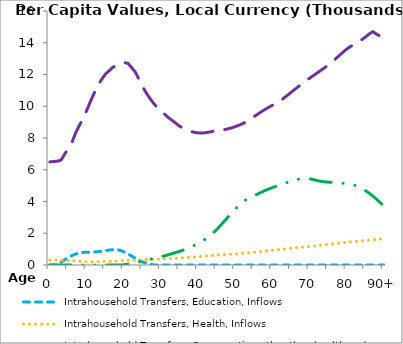
| Category | Intrahousehold Transfers, Education, Inflows | Intrahousehold Transfers, Health, Inflows | Intrahousehold Transfers, Consumption other than health and education, Inflows | Intrahousehold Transfers, Saving, Inflows |
|---|---|---|---|---|
| 0 | 0 | 315.968 | 6493.142 | 0 |
|  | 0 | 311.324 | 6522.141 | 0 |
| 2 | 13.528 | 306.679 | 6537.956 | 0 |
| 3 | 173.255 | 300.897 | 6603.939 | 0 |
| 4 | 332.982 | 291.162 | 6987.979 | 0 |
| 5 | 481.796 | 281.075 | 7336.597 | 0 |
| 6 | 604.684 | 267.98 | 7761.841 | 0 |
| 7 | 695.099 | 250.585 | 8347.404 | 0 |
| 8 | 752.086 | 232.706 | 8820.788 | 0 |
| 9 | 792.489 | 220.252 | 9223.739 | 0 |
| 10 | 805.499 | 210.448 | 9780.597 | 0 |
| 11 | 815.918 | 202.708 | 10343.697 | 0 |
| 12 | 822.001 | 203.2 | 10853.486 | 0 |
| 13 | 840.167 | 207.904 | 11344.297 | 0 |
| 14 | 864.04 | 213.391 | 11715.646 | 0 |
| 15 | 907.217 | 220.883 | 12034.079 | 0 |
| 16 | 939.192 | 234.618 | 12242.295 | 0 |
| 17 | 971.604 | 248.231 | 12459.914 | 0 |
| 18 | 955.432 | 260.945 | 12567.036 | 0 |
| 19 | 925.705 | 275.382 | 12710.646 | 0 |
| 20 | 820.123 | 289.318 | 12748.894 | 14.781 |
| 21 | 710.567 | 299.511 | 12709.178 | 56.958 |
| 22 | 565.264 | 308.724 | 12435.432 | 99.136 |
| 23 | 427.859 | 319.607 | 12154.235 | 144.733 |
| 24 | 293.01 | 327.905 | 11696.398 | 194.734 |
| 25 | 188.394 | 336.691 | 11222.785 | 250.354 |
| 26 | 111.298 | 347.12 | 10817.978 | 304.537 |
| 27 | 50.044 | 357.288 | 10475.679 | 357.046 |
| 28 | 0 | 363.721 | 10160.202 | 407.925 |
| 29 | 0 | 372.536 | 9897.525 | 463.507 |
| 30 | 0 | 379.458 | 9690.662 | 527 |
| 31 | 0 | 387.515 | 9475.044 | 587.091 |
| 32 | 0 | 397.002 | 9268.49 | 651.55 |
| 33 | 0 | 409.091 | 9095.186 | 726.077 |
| 34 | 0 | 424.781 | 8913.652 | 795.038 |
| 35 | 0 | 441.373 | 8732.514 | 861.077 |
| 36 | 0 | 457.116 | 8607.249 | 949.449 |
| 37 | 0 | 474.613 | 8500.093 | 1042.258 |
| 38 | 0 | 492.407 | 8412.782 | 1145.313 |
| 39 | 0 | 506.549 | 8352.426 | 1257.129 |
| 40 | 0 | 524.492 | 8317.836 | 1386.761 |
| 41 | 0 | 545.022 | 8311.405 | 1508.645 |
| 42 | 0 | 566.974 | 8338.126 | 1648.904 |
| 43 | 0 | 585.936 | 8376.936 | 1834.727 |
| 44 | 0 | 608.611 | 8424.544 | 2033.931 |
| 45 | 0 | 627.488 | 8473.724 | 2253.434 |
| 46 | 0 | 639.692 | 8502.014 | 2504.697 |
| 47 | 0 | 651.07 | 8526.592 | 2762.984 |
| 48 | 0 | 665.317 | 8581.363 | 3034.199 |
| 49 | 0 | 680.072 | 8644.388 | 3288.364 |
| 50 | 0 | 695.731 | 8725.599 | 3544.665 |
| 51 | 0 | 714.661 | 8813.9 | 3779.855 |
| 52 | 0 | 734.972 | 8914.01 | 3960.864 |
| 53 | 0 | 759.955 | 9041.377 | 4149.073 |
| 54 | 0 | 782.021 | 9192.248 | 4271.576 |
| 55 | 0 | 806.796 | 9348.8 | 4366.959 |
| 56 | 0 | 828.327 | 9511.169 | 4481.304 |
| 57 | 0 | 852.119 | 9662.658 | 4591.605 |
| 58 | 0 | 878.02 | 9809.703 | 4704.537 |
| 59 | 0 | 909.327 | 9943.094 | 4793.103 |
| 60 | 0 | 936.607 | 10069.959 | 4881.401 |
| 61 | 0 | 962.341 | 10197.847 | 4958.692 |
| 62 | 0 | 984.052 | 10342.298 | 5031.27 |
| 63 | 0 | 1006 | 10513.339 | 5125.607 |
| 64 | 0 | 1032.679 | 10695.727 | 5210.291 |
| 65 | 0 | 1058.836 | 10888.776 | 5313.455 |
| 66 | 0 | 1081.629 | 11075.803 | 5366.672 |
| 67 | 0 | 1103.749 | 11256.576 | 5404.7 |
| 68 | 0 | 1126.476 | 11432.094 | 5431.327 |
| 69 | 0 | 1148.465 | 11607.615 | 5443.867 |
| 70 | 0 | 1172.791 | 11776.872 | 5425.921 |
| 71 | 0 | 1197.828 | 11941.467 | 5376.957 |
| 72 | 0 | 1223.866 | 12103.378 | 5316.542 |
| 73 | 0 | 1251.218 | 12266.539 | 5274.298 |
| 74 | 0 | 1276.513 | 12433.134 | 5236.613 |
| 75 | 0 | 1302.075 | 12603.357 | 5219.732 |
| 76 | 0 | 1328.265 | 12797.668 | 5202.85 |
| 77 | 0 | 1355.485 | 13003.401 | 5185.969 |
| 78 | 0 | 1384.151 | 13214.742 | 5169.087 |
| 79 | 0 | 1413.691 | 13421.836 | 5152.176 |
| 80 | 0 | 1439.748 | 13612.462 | 5135.177 |
| 81 | 0 | 1459.012 | 13766.844 | 5094.406 |
| 82 | 0 | 1476.046 | 13904.886 | 5022.916 |
| 83 | 0 | 1493.615 | 14040.861 | 4940.269 |
| 84 | 0 | 1517.525 | 14198.133 | 4821.004 |
| 85 | 0 | 1541.419 | 14362.627 | 4680.213 |
| 86 | 0 | 1565.262 | 14558.856 | 4519.125 |
| 87 | 0 | 1589.079 | 14702.747 | 4336.809 |
| 88 | 0 | 1612.866 | 14530.262 | 4129.856 |
| 89 | 0 | 1636.646 | 14420.513 | 3917.416 |
| 90+ | 0 | 1660.427 | 14310.763 | 3704.977 |